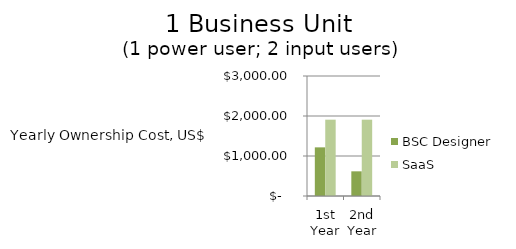
| Category | BSC Designer  | SaaS |
|---|---|---|
| 1st Year | 1216 | 1908 |
| 2nd Year | 616.8 | 1908 |